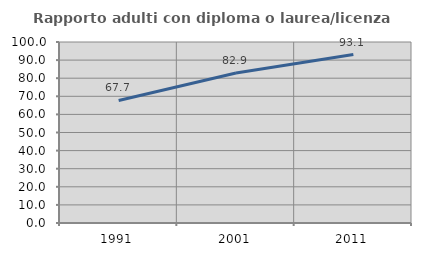
| Category | Rapporto adulti con diploma o laurea/licenza media  |
|---|---|
| 1991.0 | 67.709 |
| 2001.0 | 82.869 |
| 2011.0 | 93.079 |